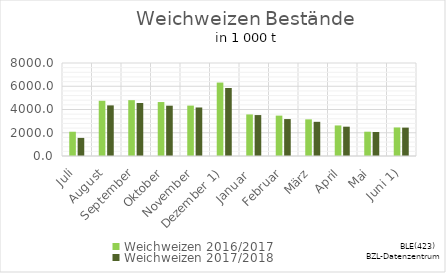
| Category | Weichweizen |
|---|---|
| Juli | 1556.632 |
| August | 4353.648 |
| September | 4561.287 |
| Oktober | 4327.199 |
| November | 4174.066 |
| Dezember 1) | 5851.876 |
| Januar  | 3521.499 |
| Februar | 3177.75 |
| März | 2940.511 |
| April | 2521.78 |
| Mai | 2067.088 |
| Juni 1) | 2441.495 |